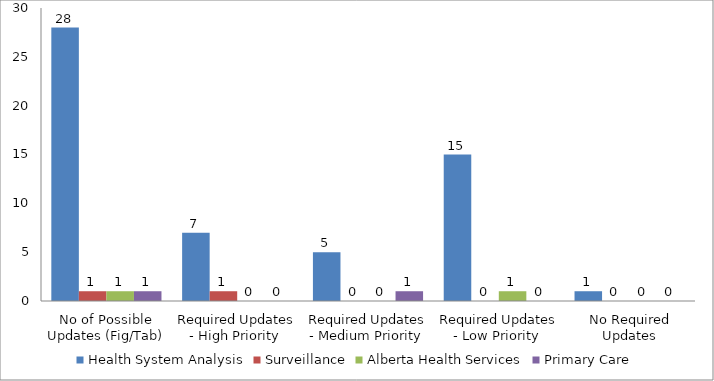
| Category | Health System Analysis | Surveillance | Alberta Health Services | Primary Care |
|---|---|---|---|---|
| No of Possible Updates (Fig/Tab) | 28 | 1 | 1 | 1 |
| Required Updates - High Priority  | 7 | 1 | 0 | 0 |
| Required Updates - Medium Priority  | 5 | 0 | 0 | 1 |
| Required Updates - Low Priority  | 15 | 0 | 1 | 0 |
| No Required Updates | 1 | 0 | 0 | 0 |